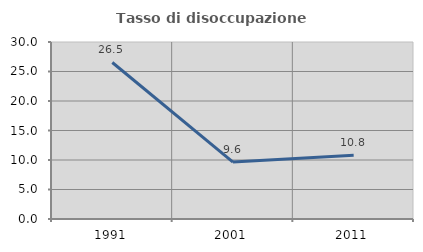
| Category | Tasso di disoccupazione giovanile  |
|---|---|
| 1991.0 | 26.526 |
| 2001.0 | 9.646 |
| 2011.0 | 10.8 |